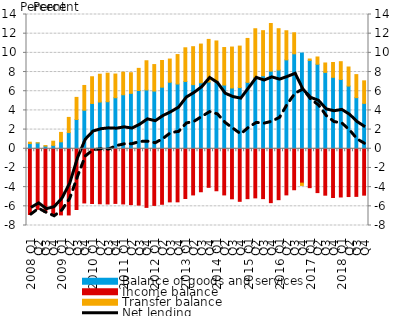
| Category | Balance of goods and services | Income balance | Transfer balance |
|---|---|---|---|
| 2008 Q1 | 0.542 | -6.855 | 0.144 |
| Q2 | 0.607 | -6.318 | 0.016 |
| Q3 | 0.276 | -6.627 | 0.057 |
| Q4 | 0.356 | -6.874 | 0.434 |
| 2009 Q1 | 0.725 | -6.896 | 0.982 |
| Q2 | 1.689 | -6.9 | 1.582 |
| Q3 | 3.052 | -6.333 | 2.306 |
| Q4 | 4.018 | -5.649 | 2.584 |
| 2010 Q1 | 4.723 | -5.709 | 2.785 |
| Q2 | 4.875 | -5.734 | 2.897 |
| Q3 | 4.906 | -5.753 | 2.976 |
| Q4 | 5.323 | -5.696 | 2.468 |
| 2011 Q1 | 5.632 | -5.751 | 2.353 |
| Q2 | 5.782 | -5.822 | 2.145 |
| Q3 | 6.075 | -5.873 | 2.309 |
| Q4 | 6.133 | -6.11 | 3.044 |
| 2012 Q1 | 6.016 | -5.905 | 2.764 |
| Q2 | 6.423 | -5.787 | 2.783 |
| Q3 | 6.938 | -5.537 | 2.417 |
| Q4 | 6.753 | -5.533 | 3.069 |
| 2013 Q1 | 7.019 | -5.186 | 3.511 |
| Q2 | 6.687 | -4.813 | 3.957 |
| Q3 | 6.877 | -4.481 | 4.041 |
| Q4 | 6.964 | -4.021 | 4.439 |
| 2014 Q1 | 7.045 | -4.377 | 4.196 |
| Q2 | 6.644 | -4.812 | 3.912 |
| Q3 | 6.341 | -5.217 | 4.266 |
| Q4 | 6.378 | -5.478 | 4.33 |
| 2015 Q1 | 6.926 | -5.202 | 4.579 |
| Q2 | 7.419 | -5.119 | 5.096 |
| Q3 | 7.611 | -5.199 | 4.703 |
| Q4 | 8.097 | -5.618 | 4.963 |
| 2016 Q1 | 8.211 | -5.308 | 4.308 |
| Q2 | 9.27 | -4.808 | 3.036 |
| Q3 | 9.902 | -4.273 | 2.193 |
| Q4 | 9.98 | -3.582 | -0.238 |
| 2017 Q1 | 9.216 | -4.054 | 0.144 |
| Q2 | 8.816 | -4.57 | 0.754 |
| Q3 | 7.963 | -4.839 | 0.982 |
| Q4 | 7.449 | -5.084 | 1.549 |
| 2018 Q1 | 7.227 | -5.027 | 1.853 |
| Q2 | 6.54 | -4.982 | 1.986 |
| Q3 | 5.33 | -4.964 | 2.403 |
| Q4 | 4.734 | -4.835 | 2.347 |